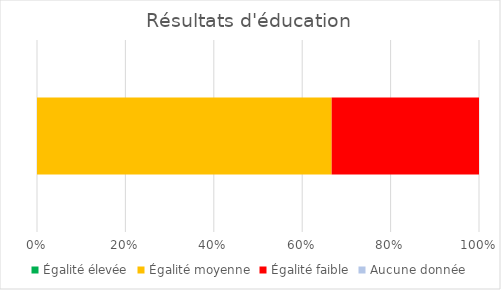
| Category | Égalité élevée | Égalité moyenne | Égalité faible | Aucune donnée |
|---|---|---|---|---|
| 0 | 0 | 2 | 1 | 0 |